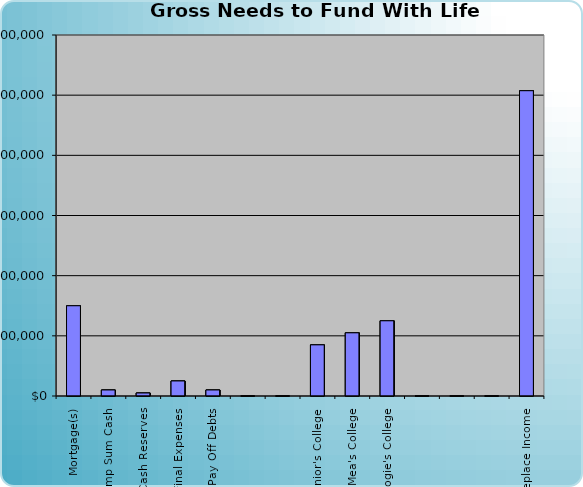
| Category | Series 0 |
|---|---|
| Mortgage(s) | 150000 |
| Lump Sum Cash | 10000 |
| Cash Reserves | 5000 |
| Final Expenses | 25000 |
| Pay Off Debts | 10000 |
|   | 0 |
|   | 0 |
| Junior's College | 85000 |
| Sallie Mea's College | 105000 |
| Doogie's College | 125000 |
|   | 0 |
|   | 0 |
|   | 0 |
| Replace Income | 507417.276 |